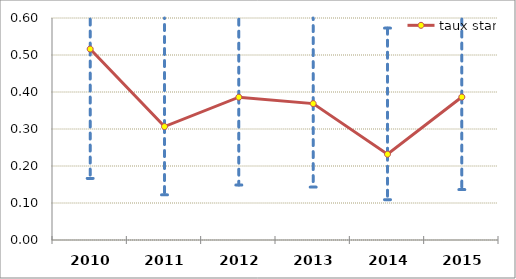
| Category | taux stand |
|---|---|
| 2010.0 | 0.516 |
| 2011.0 | 0.307 |
| 2012.0 | 0.386 |
| 2013.0 | 0.369 |
| 2014.0 | 0.232 |
| 2015.0 | 0.386 |